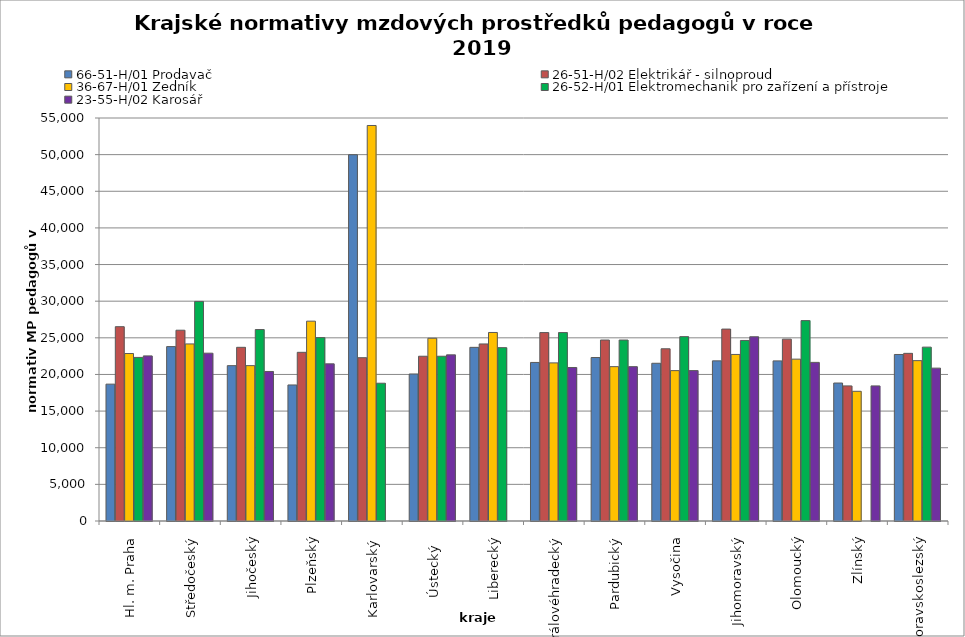
| Category | 66-51-H/01 Prodavač | 26-51-H/02 Elektrikář - silnoproud | 36-67-H/01 Zedník | 26-52-H/01 Elektromechanik pro zařízení a přístroje | 23-55-H/02 Karosář |
|---|---|---|---|---|---|
| Hl. m. Praha | 18677.043 | 26519.337 | 22857.143 | 22325.581 | 22535.211 |
| Středočeský | 23800.52 | 26037.759 | 24166.716 | 29967.371 | 22904.496 |
| Jihočeský | 21202.15 | 23704.199 | 21203.436 | 26130.93 | 20406.133 |
| Plzeňský | 18566.392 | 23020.884 | 27272.727 | 25026.399 | 21447.964 |
| Karlovarský  | 49988.802 | 22286.57 | 53978.235 | 18803.707 | 0 |
| Ústecký   | 20063.8 | 22486.01 | 24941.379 | 22486.01 | 22673.981 |
| Liberecký | 23699.402 | 24163.183 | 25728.791 | 23658.54 | 0 |
| Královéhradecký | 21639.511 | 25715.819 | 21578.612 | 25715.819 | 20949.727 |
| Pardubický | 22310.503 | 24699.621 | 21065.314 | 24699.621 | 21065.314 |
| Vysočina | 21526.966 | 23504.46 | 20523.718 | 25162.723 | 20523.718 |
| Jihomoravský | 21854.908 | 26191.246 | 22729.84 | 24642.451 | 25144.62 |
| Olomoucký | 21851.925 | 24818.099 | 22089.231 | 27348.571 | 21648.426 |
| Zlínský | 18830.298 | 18438 | 17700.48 | 0 | 18438 |
| Moravskoslezský | 22726.836 | 22880.619 | 21886.269 | 23729.323 | 20863.817 |